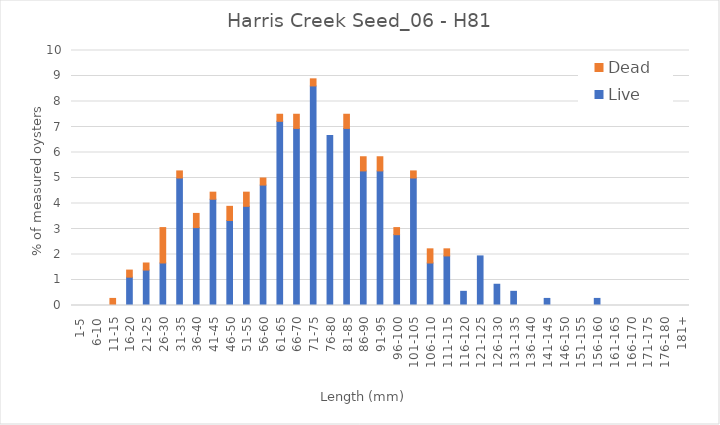
| Category | Live | Dead |
|---|---|---|
| 1-5 | 0 | 0 |
| 6-10 | 0 | 0 |
| 11-15 | 0 | 0.278 |
| 16-20 | 1.111 | 0.278 |
| 21-25 | 1.389 | 0.278 |
| 26-30 | 1.667 | 1.389 |
| 31-35 | 5 | 0.278 |
| 36-40 | 3.056 | 0.556 |
| 41-45 | 4.167 | 0.278 |
| 46-50 | 3.333 | 0.556 |
| 51-55 | 3.889 | 0.556 |
| 56-60 | 4.722 | 0.278 |
| 61-65 | 7.222 | 0.278 |
| 66-70 | 6.944 | 0.556 |
| 71-75 | 8.611 | 0.278 |
| 76-80 | 6.667 | 0 |
| 81-85 | 6.944 | 0.556 |
| 86-90 | 5.278 | 0.556 |
| 91-95 | 5.278 | 0.556 |
| 96-100 | 2.778 | 0.278 |
| 101-105 | 5 | 0.278 |
| 106-110 | 1.667 | 0.556 |
| 111-115 | 1.944 | 0.278 |
| 116-120 | 0.556 | 0 |
| 121-125 | 1.944 | 0 |
| 126-130 | 0.833 | 0 |
| 131-135 | 0.556 | 0 |
| 136-140 | 0 | 0 |
| 141-145 | 0.278 | 0 |
| 146-150 | 0 | 0 |
| 151-155 | 0 | 0 |
| 156-160 | 0.278 | 0 |
| 161-165 | 0 | 0 |
| 166-170 | 0 | 0 |
| 171-175 | 0 | 0 |
| 176-180 | 0 | 0 |
| 181+ | 0 | 0 |